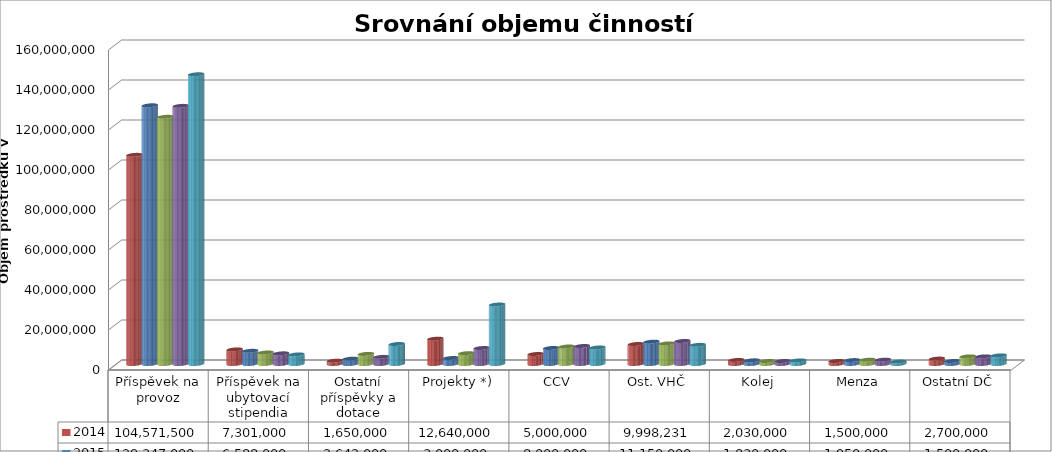
| Category | 2014  | 2015  | 2016  | 2017 | 2018  |
|---|---|---|---|---|---|
| Příspěvek na provoz | 104571500 | 129347000 | 123595710 | 129060200 | 144853284 |
| Příspěvek na ubytovací stipendia | 7301000 | 6588000 | 5762000 | 5329800 | 4784400 |
| Ostatní příspěvky a dotace | 1650000 | 2642000 | 5044800 | 3565500 | 9995000 |
| Projekty *) | 12640000 | 3000000 | 5400000 | 8000000 | 29737020 |
| CCV | 5000000 | 8000000 | 8750000 | 9000000 | 8250000 |
| Ost. VHČ | 9998231 | 11150000 | 10300000 | 11500000 | 9571000 |
| Kolej | 2030000 | 1830000 | 1500000 | 1500000 | 1800000 |
| Menza | 1500000 | 1950000 | 2150000 | 2150000 | 1200000 |
| Ostatní DČ | 2700000 | 1500000 | 3810000 | 3810000 | 4300000 |